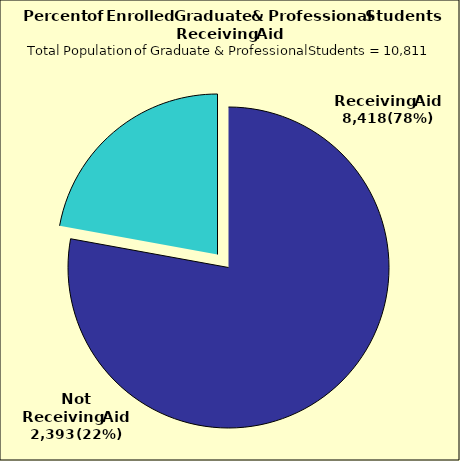
| Category | Series 0 |
|---|---|
| 0 | 8418 |
| 1 | 2393 |